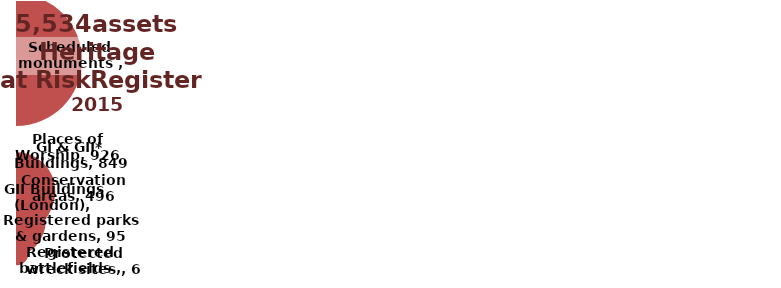
| Category | x |
|---|---|
| 0 | 866 |
| 1 | 4 |
| 2 | 930 |
| 3 | 428 |
| 4 | 2701 |
| 5 | 94 |
| 6 | 6 |
| 7 | 505 |